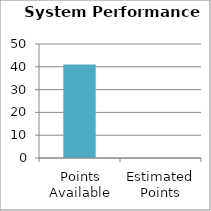
| Category | System Performance |
|---|---|
| Points Available | 41 |
| Estimated Points | 0 |